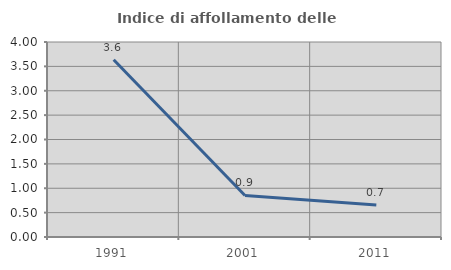
| Category | Indice di affollamento delle abitazioni  |
|---|---|
| 1991.0 | 3.636 |
| 2001.0 | 0.852 |
| 2011.0 | 0.658 |